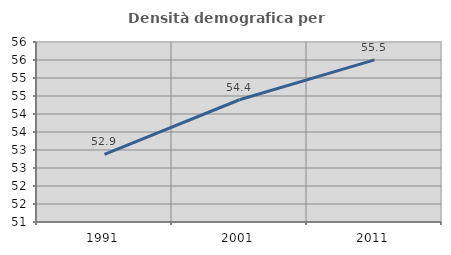
| Category | Densità demografica |
|---|---|
| 1991.0 | 52.877 |
| 2001.0 | 54.395 |
| 2011.0 | 55.502 |